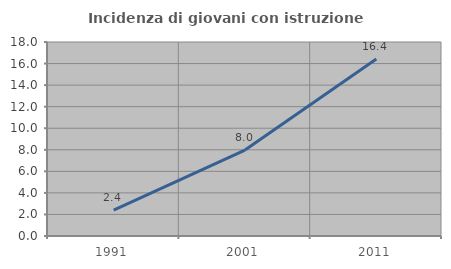
| Category | Incidenza di giovani con istruzione universitaria |
|---|---|
| 1991.0 | 2.391 |
| 2001.0 | 7.97 |
| 2011.0 | 16.422 |